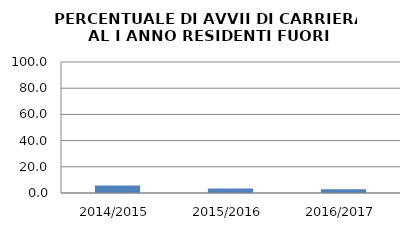
| Category | 2014/2015 2015/2016 2016/2017 |
|---|---|
| 2014/2015 | 5.747 |
| 2015/2016 | 3.529 |
| 2016/2017 | 2.817 |